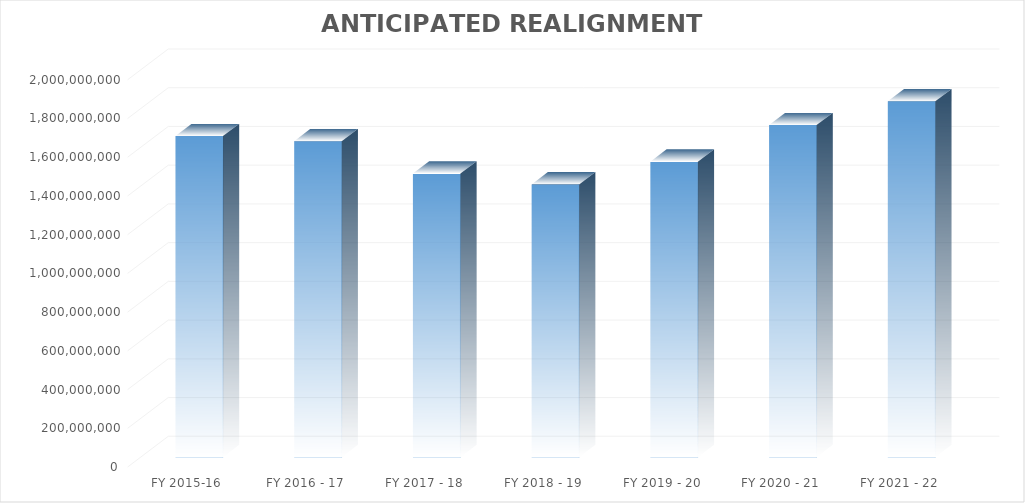
| Category | TOTAL |
|---|---|
| FY 2015-16 | 1658454920 |
| FY 2016 - 17 | 1631955963.588 |
| FY 2017 - 18 | 1464478834.109 |
| FY 2018 - 19 | 1408592519.954 |
| FY 2019 - 20 | 1526042408.394 |
| FY 2020 - 21 | 1715416383.726 |
| FY 2021 - 22 | 1837876248.735 |